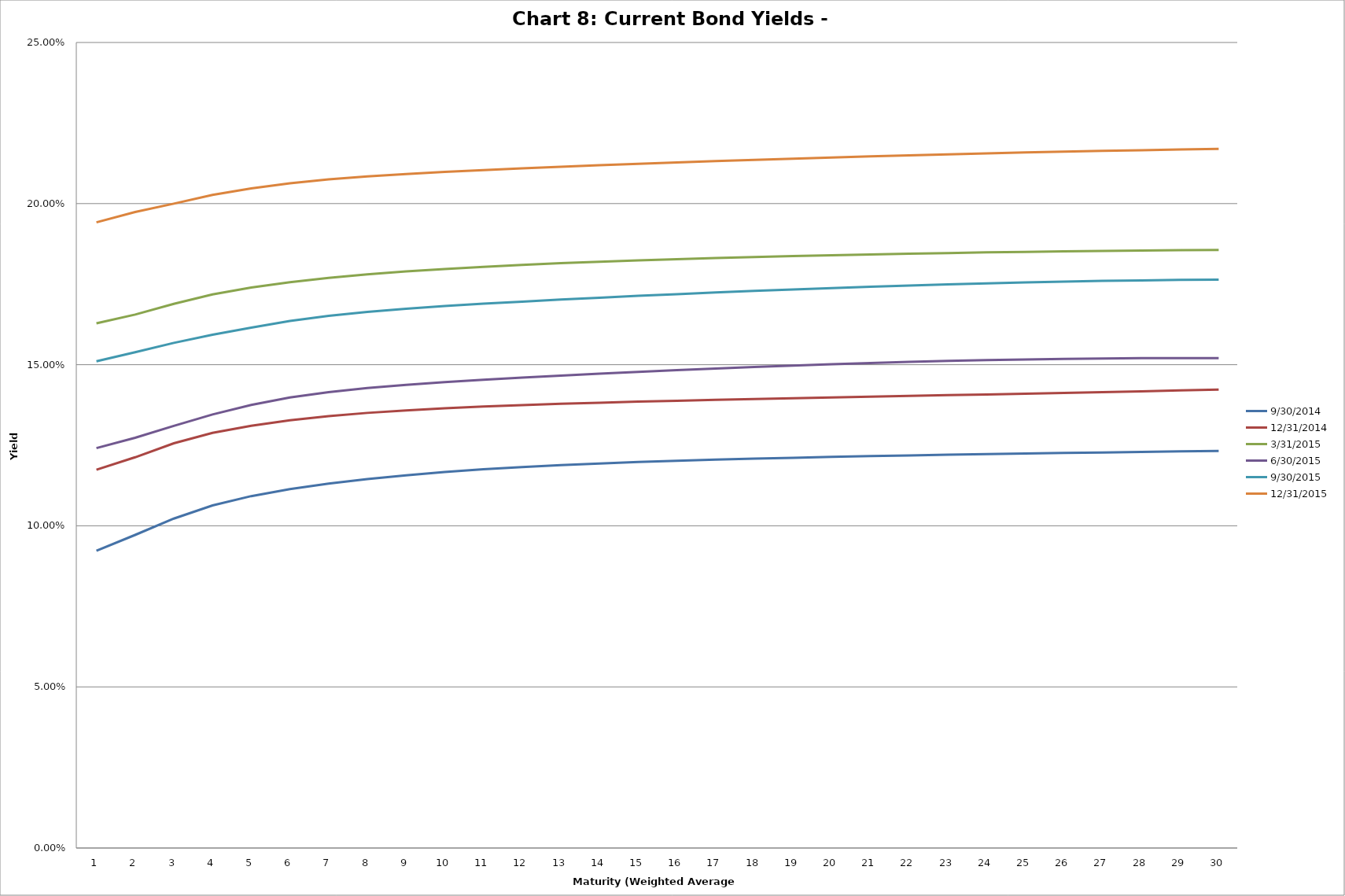
| Category | 9/30/2014 | 12/31/2014 | 3/31/2015 | 6/30/2015 | 9/30/2015 | 12/31/2015 |
|---|---|---|---|---|---|---|
| 0 | 0.092 | 0.117 | 0.163 | 0.124 | 0.151 | 0.194 |
| 1 | 0.097 | 0.121 | 0.166 | 0.127 | 0.154 | 0.197 |
| 2 | 0.102 | 0.126 | 0.169 | 0.131 | 0.157 | 0.2 |
| 3 | 0.106 | 0.129 | 0.172 | 0.135 | 0.159 | 0.203 |
| 4 | 0.109 | 0.131 | 0.174 | 0.138 | 0.162 | 0.205 |
| 5 | 0.111 | 0.133 | 0.176 | 0.14 | 0.164 | 0.206 |
| 6 | 0.113 | 0.134 | 0.177 | 0.141 | 0.165 | 0.208 |
| 7 | 0.115 | 0.135 | 0.178 | 0.143 | 0.166 | 0.208 |
| 8 | 0.116 | 0.136 | 0.179 | 0.144 | 0.167 | 0.209 |
| 9 | 0.117 | 0.136 | 0.18 | 0.145 | 0.168 | 0.21 |
| 10 | 0.118 | 0.137 | 0.18 | 0.145 | 0.169 | 0.21 |
| 11 | 0.118 | 0.137 | 0.181 | 0.146 | 0.17 | 0.211 |
| 12 | 0.119 | 0.138 | 0.181 | 0.147 | 0.17 | 0.211 |
| 13 | 0.119 | 0.138 | 0.182 | 0.147 | 0.171 | 0.212 |
| 14 | 0.12 | 0.139 | 0.182 | 0.148 | 0.171 | 0.212 |
| 15 | 0.12 | 0.139 | 0.183 | 0.148 | 0.172 | 0.213 |
| 16 | 0.121 | 0.139 | 0.183 | 0.149 | 0.172 | 0.213 |
| 17 | 0.121 | 0.139 | 0.183 | 0.149 | 0.173 | 0.214 |
| 18 | 0.121 | 0.14 | 0.184 | 0.15 | 0.173 | 0.214 |
| 19 | 0.121 | 0.14 | 0.184 | 0.15 | 0.174 | 0.214 |
| 20 | 0.122 | 0.14 | 0.184 | 0.151 | 0.174 | 0.215 |
| 21 | 0.122 | 0.14 | 0.184 | 0.151 | 0.175 | 0.215 |
| 22 | 0.122 | 0.141 | 0.185 | 0.151 | 0.175 | 0.215 |
| 23 | 0.122 | 0.141 | 0.185 | 0.151 | 0.175 | 0.216 |
| 24 | 0.122 | 0.141 | 0.185 | 0.152 | 0.176 | 0.216 |
| 25 | 0.123 | 0.141 | 0.185 | 0.152 | 0.176 | 0.216 |
| 26 | 0.123 | 0.141 | 0.185 | 0.152 | 0.176 | 0.216 |
| 27 | 0.123 | 0.142 | 0.185 | 0.152 | 0.176 | 0.217 |
| 28 | 0.123 | 0.142 | 0.186 | 0.152 | 0.176 | 0.217 |
| 29 | 0.123 | 0.142 | 0.186 | 0.152 | 0.176 | 0.217 |